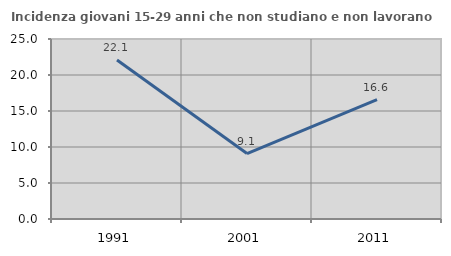
| Category | Incidenza giovani 15-29 anni che non studiano e non lavorano  |
|---|---|
| 1991.0 | 22.086 |
| 2001.0 | 9.091 |
| 2011.0 | 16.571 |